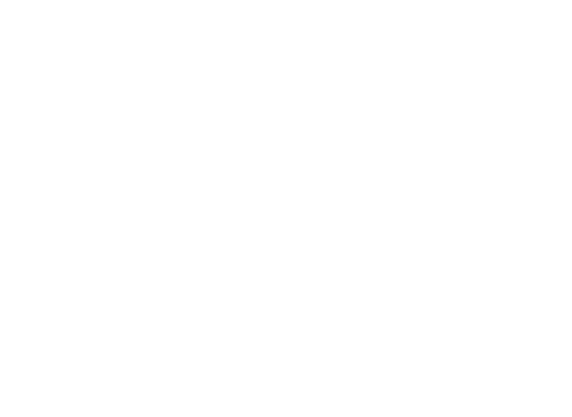
| Category | Tons |
|---|---|
| Residential Refuse Diverted to Residential SSO Collection Program | 0 |
| Residential Refuse Disposed  | 0 |